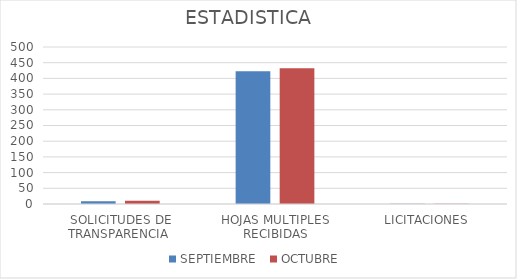
| Category | SEPTIEMBRE  | OCTUBRE  |
|---|---|---|
| SOLICITUDES DE TRANSPARENCIA  | 9 | 10 |
| HOJAS MULTIPLES RECIBIDAS | 423 | 432 |
| LICITACIONES  | 1 | 1 |